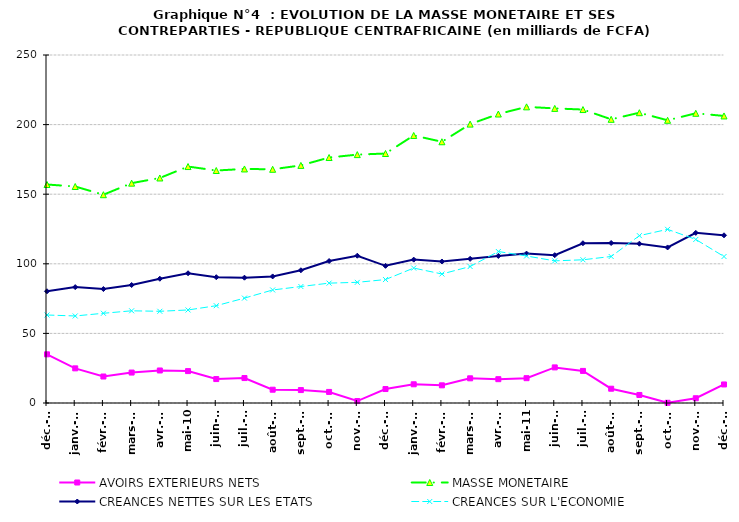
| Category | AVOIRS EXTERIEURS NETS | MASSE MONETAIRE | CREANCES NETTES SUR LES ETATS | CREANCES SUR L'ECONOMIE |
|---|---|---|---|---|
| 2009-12-04 | 34958 | 156967 | 80275 | 63217 |
| 2010-01-04 | 24888 | 155529 | 83249 | 62521 |
| 2010-02-04 | 19028 | 149633 | 81869 | 64461 |
| 2010-03-04 | 21874 | 157941 | 84750 | 66228 |
| 2010-04-04 | 23367 | 161653 | 89264 | 65880 |
| 2010-05-04 | 22916 | 169869 | 93206 | 66837 |
| 2010-06-04 | 17187 | 167015 | 90364 | 69889 |
| 2010-07-04 | 17915 | 168135 | 90016 | 75349 |
| 2010-08-04 | 9552 | 167894 | 90926 | 81201 |
| 2010-09-04 | 9283 | 170688 | 95353 | 83670 |
| 2010-10-04 | 7949 | 176350 | 101977 | 86109 |
| 2010-11-04 | 1401 | 178431 | 105807 | 86688 |
| 2010-12-04 | 10029 | 179232 | 98542 | 88683 |
| 2011-01-01 | 13440 | 192186 | 102998 | 96942 |
| 2011-02-01 | 12688 | 187673 | 101657 | 92678 |
| 2011-03-01 | 17734 | 200348 | 103548 | 98038 |
| 2011-04-01 | 17111 | 207595 | 105645 | 108828 |
| 2011-05-01 | 17827 | 212750 | 107326 | 105610 |
| 2011-06-01 | 25572 | 211637 | 106178 | 102105 |
| 2011-07-01 | 23053 | 210809 | 114779 | 102892 |
| 2011-08-01 | 10268 | 203796 | 114953 | 105246 |
| 2011-09-01 | 5772 | 208540 | 114448 | 120211 |
| 2011-10-01 | 150 | 203092 | 111747 | 124754 |
| 2011-11-01 | 3422 | 208121 | 122214 | 117500 |
| 2011-12-01 | 13316 | 206219 | 120483 | 105220 |